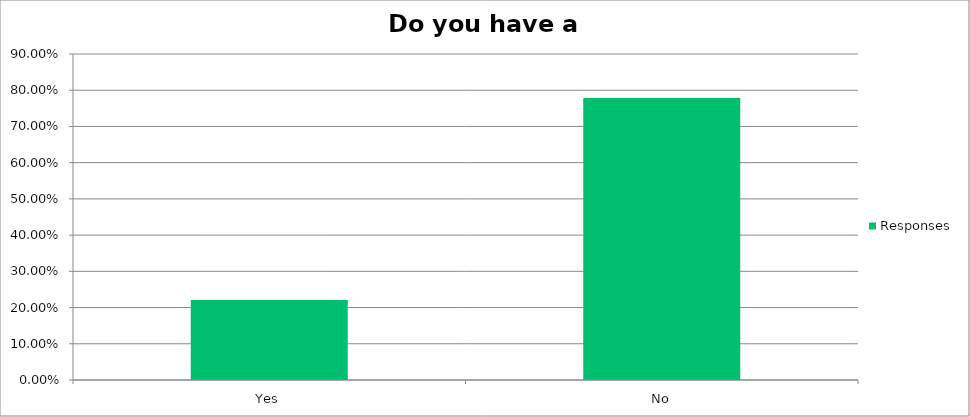
| Category | Responses |
|---|---|
| Yes | 0.221 |
| No | 0.779 |